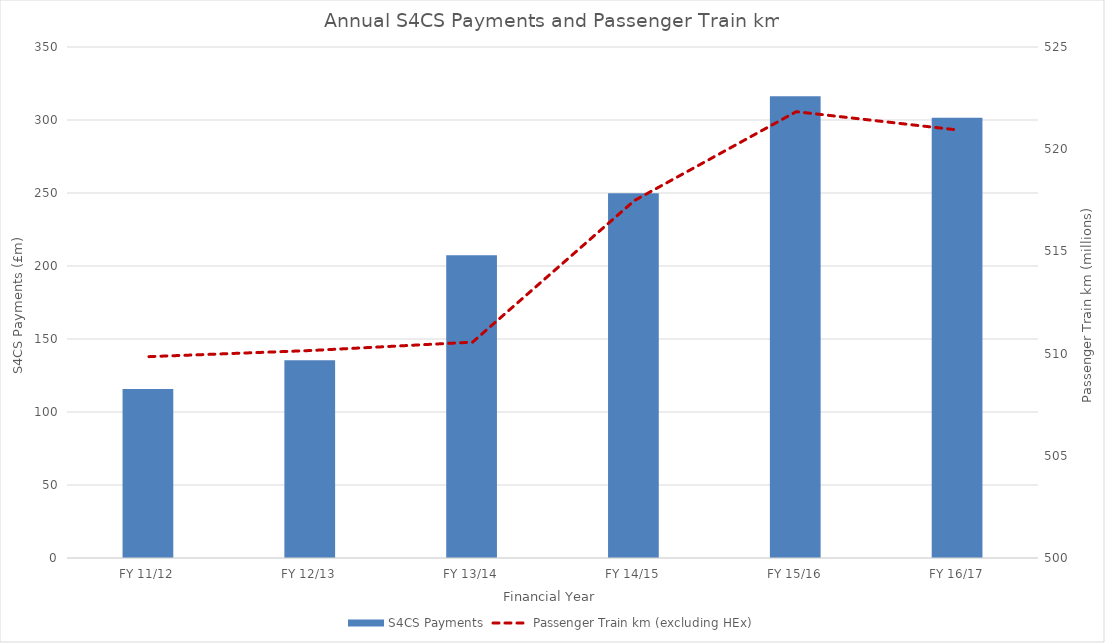
| Category | S4CS Payments |
|---|---|
| FY 11/12 | 115.701 |
| FY 12/13 | 135.424 |
| FY 13/14 | 207.392 |
| FY 14/15 | 249.792 |
| FY 15/16 | 316.239 |
| FY 16/17 | 301.539 |